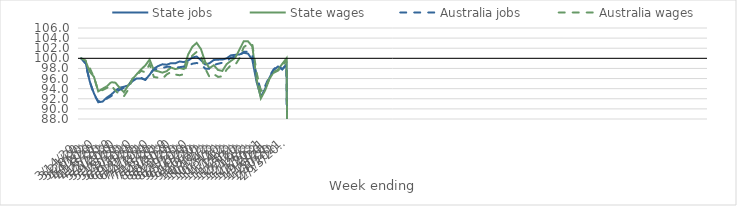
| Category | State jobs | State wages | Australia jobs | Australia wages |
|---|---|---|---|---|
| 14/03/2020 | 100 | 100 | 100 | 100 |
| 21/03/2020 | 99.333 | 99.532 | 98.956 | 99.592 |
| 28/03/2020 | 95.465 | 97.383 | 95.411 | 98.113 |
| 04/04/2020 | 93.048 | 96.33 | 92.812 | 96.235 |
| 11/04/2020 | 91.315 | 93.469 | 91.52 | 93.527 |
| 18/04/2020 | 91.44 | 93.985 | 91.496 | 93.723 |
| 25/04/2020 | 92.227 | 94.455 | 92.021 | 94.131 |
| 02/05/2020 | 92.813 | 95.283 | 92.516 | 94.682 |
| 09/05/2020 | 93.579 | 95.187 | 93.196 | 93.605 |
| 16/05/2020 | 94.197 | 94.17 | 93.786 | 92.839 |
| 23/05/2020 | 94.375 | 93.289 | 94.144 | 92.494 |
| 30/05/2020 | 94.636 | 94.647 | 94.649 | 93.8 |
| 06/06/2020 | 95.469 | 95.869 | 95.633 | 95.98 |
| 13/06/2020 | 96.031 | 96.872 | 96.135 | 96.637 |
| 20/06/2020 | 96.032 | 97.804 | 96.155 | 97.543 |
| 27/06/2020 | 95.777 | 98.6 | 95.736 | 97.22 |
| 04/07/2020 | 96.736 | 99.748 | 96.811 | 98.854 |
| 11/07/2020 | 97.973 | 97.628 | 97.797 | 96.324 |
| 18/07/2020 | 98.473 | 97.429 | 97.892 | 96.165 |
| 25/07/2020 | 98.82 | 97.17 | 98.105 | 95.98 |
| 01/08/2020 | 98.731 | 97.463 | 98.318 | 96.817 |
| 08/08/2020 | 99.042 | 98.193 | 98.31 | 97.297 |
| 15/08/2020 | 99.018 | 97.874 | 98.2 | 96.802 |
| 22/08/2020 | 99.374 | 98.084 | 98.249 | 96.652 |
| 29/08/2020 | 99.255 | 97.886 | 98.38 | 96.868 |
| 05/09/2020 | 99.553 | 100.743 | 98.54 | 99.571 |
| 12/09/2020 | 100.16 | 102.3 | 98.935 | 100.548 |
| 19/09/2020 | 100.352 | 103.055 | 99.081 | 101.275 |
| 26/09/2020 | 99.635 | 101.822 | 98.859 | 100.413 |
| 03/10/2020 | 98.784 | 99.265 | 97.958 | 97.98 |
| 10/10/2020 | 99.038 | 98.07 | 97.945 | 96.303 |
| 17/10/2020 | 99.671 | 98.631 | 98.678 | 96.878 |
| 24/10/2020 | 99.743 | 97.696 | 98.932 | 96.325 |
| 31/10/2020 | 99.751 | 97.511 | 99.127 | 96.446 |
| 07/11/2020 | 99.99 | 98.851 | 99.458 | 97.753 |
| 14/11/2020 | 100.592 | 99.496 | 100.12 | 98.654 |
| 21/11/2020 | 100.694 | 100.093 | 100.358 | 98.686 |
| 28/11/2020 | 100.763 | 101.71 | 100.609 | 100.004 |
| 05/12/2020 | 101.099 | 103.392 | 101.271 | 102.199 |
| 12/12/2020 | 100.929 | 103.358 | 101.353 | 102.847 |
| 19/12/2020 | 99.736 | 102.375 | 100.515 | 102.738 |
| 26/12/2020 | 95.343 | 95.91 | 96.696 | 97.23 |
| 02/01/2021 | 92.412 | 92.087 | 93.609 | 93.51 |
| 09/01/2021 | 93.982 | 93.67 | 94.526 | 94.153 |
| 16/01/2021 | 96.158 | 95.914 | 96.434 | 96.036 |
| 23/01/2021 | 97.687 | 97.304 | 97.839 | 97.148 |
| 30/01/2021 | 98.388 | 97.749 | 98.639 | 97.559 |
| 06/02/2021 | 97.795 | 98.905 | 97.828 | 98.431 |
| 13/02/2021 | 98.879 | 100.015 | 98.686 | 99.61 |